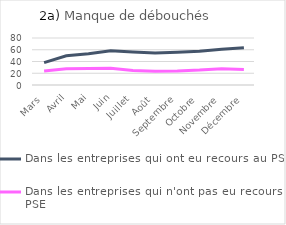
| Category | Dans les entreprises qui ont eu recours au PSE  | Dans les entreprises qui n'ont pas eu recours au PSE  |
|---|---|---|
| Mars | 38.143 | 24.003 |
| Avril | 49.752 | 27.799 |
| Mai | 53.016 | 28.213 |
| Juin | 58.192 | 28.314 |
| Juillet | 56.222 | 24.841 |
| Août | 54.334 | 23.531 |
| Septembre | 55.657 | 23.958 |
| Octobre | 57.416 | 25.337 |
| Novembre | 60.738 | 27.616 |
| Décembre | 63.501 | 26.378 |